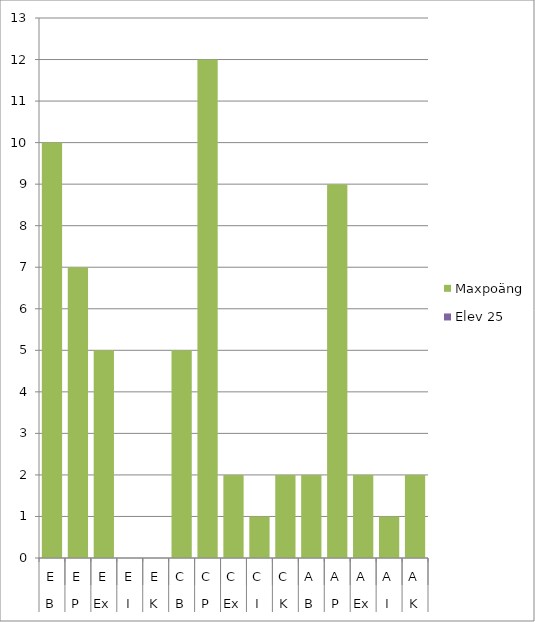
| Category | Maxpoäng | Elev 25 |
|---|---|---|
| 0 | 10 | 0 |
| 1 | 7 | 0 |
| 2 | 5 | 0 |
| 3 | 0 | 0 |
| 4 | 0 | 0 |
| 5 | 5 | 0 |
| 6 | 12 | 0 |
| 7 | 2 | 0 |
| 8 | 1 | 0 |
| 9 | 2 | 0 |
| 10 | 2 | 0 |
| 11 | 9 | 0 |
| 12 | 2 | 0 |
| 13 | 1 | 0 |
| 14 | 2 | 0 |